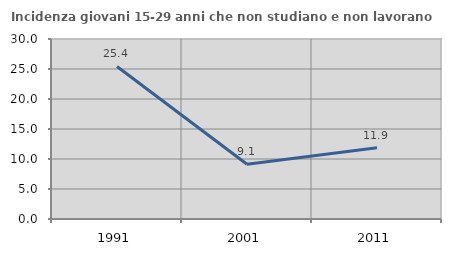
| Category | Incidenza giovani 15-29 anni che non studiano e non lavorano  |
|---|---|
| 1991.0 | 25.424 |
| 2001.0 | 9.115 |
| 2011.0 | 11.88 |